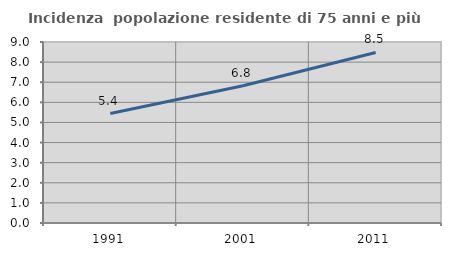
| Category | Incidenza  popolazione residente di 75 anni e più |
|---|---|
| 1991.0 | 5.444 |
| 2001.0 | 6.824 |
| 2011.0 | 8.481 |